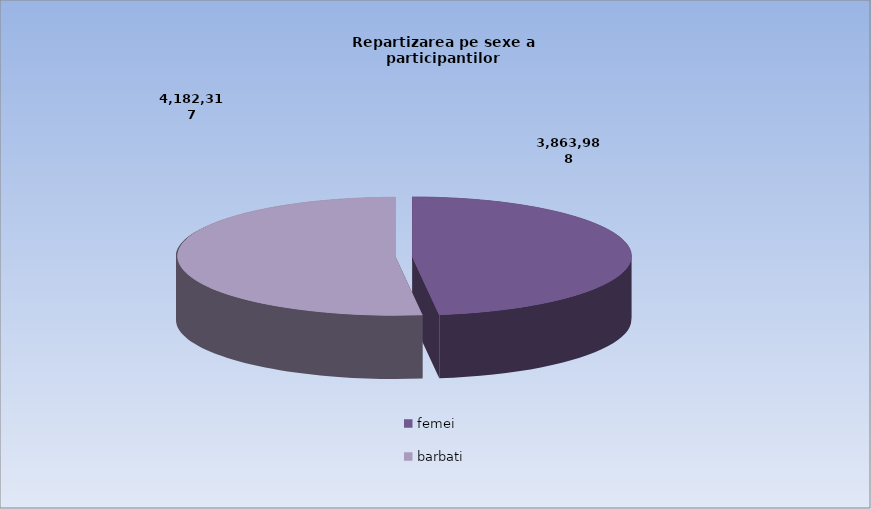
| Category | Series 0 |
|---|---|
| femei | 3863988 |
| barbati | 4182317 |